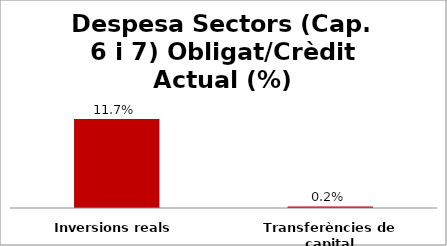
| Category | Series 0 |
|---|---|
| Inversions reals | 0.117 |
| Transferències de capital | 0.002 |